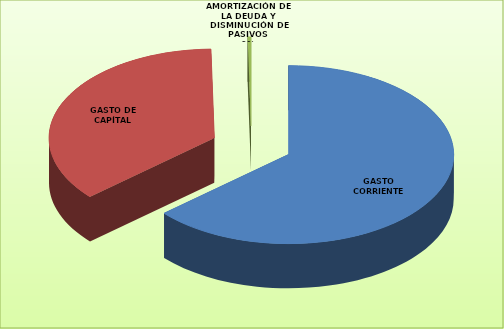
| Category | Series 0 |
|---|---|
| GASTO CORRIENTE | 22284327 |
| GASTO DE CAPÍTAL | 12669770 |
| AMORTIZACIÓN DE LA DEUDA Y DISMINUCIÓN DE PASIVOS | 114860 |